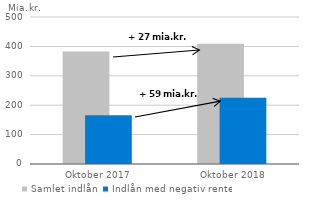
| Category | Samlet indlån | Indlån med negativ rente |
|---|---|---|
| Oktober 2017 | 382.521 | 166.207 |
| Oktober 2018 | 409.053 | 225.599 |